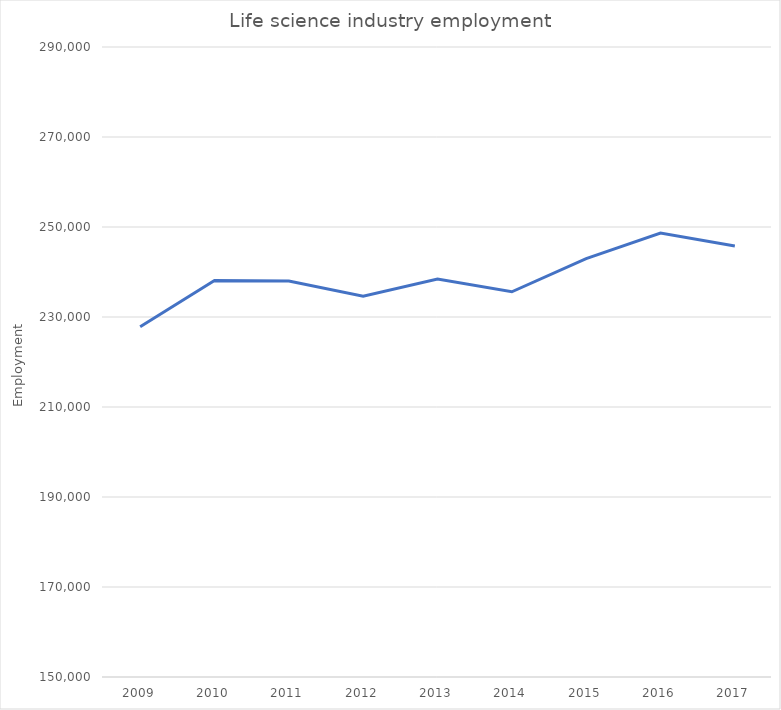
| Category | Life science industry employment |
|---|---|
| 2009 | 227855 |
| 2010 | 238120 |
| 2011 | 237987 |
| 2012 | 234612 |
| 2013 | 238450 |
| 2014 | 235612 |
| 2015 | 242963 |
| 2016 | 248665 |
| 2017 | 245770 |